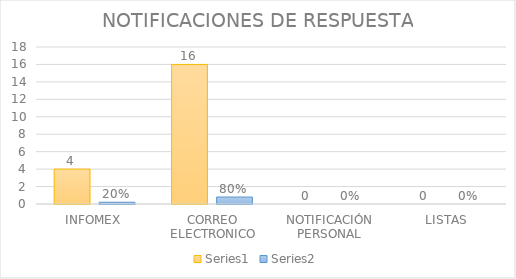
| Category | Series 3 | Series 4 |
|---|---|---|
| INFOMEX | 4 | 0.2 |
| CORREO ELECTRONICO | 16 | 0.8 |
| NOTIFICACIÓN PERSONAL | 0 | 0 |
| LISTAS | 0 | 0 |